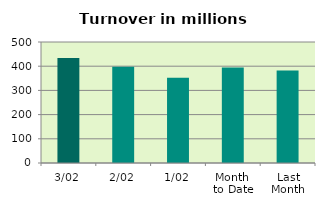
| Category | Series 0 |
|---|---|
| 3/02 | 433.436 |
| 2/02 | 397.879 |
| 1/02 | 351.999 |
| Month 
to Date | 394.438 |
| Last
Month | 381.872 |